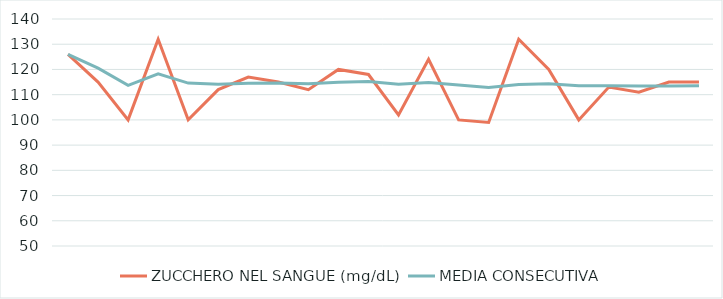
| Category | ZUCCHERO NEL SANGUE (mg/dL) | MEDIA CONSECUTIVA |
|---|---|---|
| 0 | 126 | 126 |
| 1 | 115 | 120.5 |
| 2 | 100 | 113.667 |
| 3 | 132 | 118.25 |
| 4 | 100 | 114.6 |
| 5 | 112 | 114.167 |
| 6 | 117 | 114.571 |
| 7 | 115 | 114.625 |
| 8 | 112 | 114.333 |
| 9 | 120 | 114.9 |
| 10 | 118 | 115.182 |
| 11 | 102 | 114.083 |
| 12 | 124 | 114.846 |
| 13 | 100 | 113.786 |
| 14 | 99 | 112.8 |
| 15 | 132 | 114 |
| 16 | 120 | 114.353 |
| 17 | 100 | 113.556 |
| 18 | 113 | 113.526 |
| 19 | 111 | 113.4 |
| 20 | 115 | 113.476 |
| 21 | 115 | 113.545 |